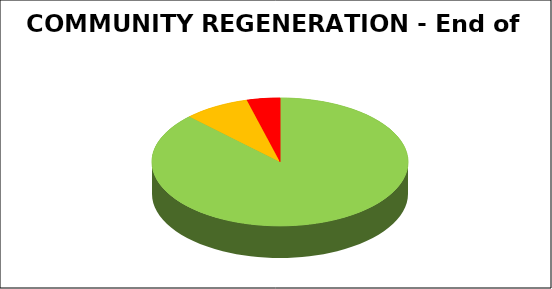
| Category | Series 0 |
|---|---|
| Green | 0.875 |
| Amber | 0.083 |
| Red | 0.042 |